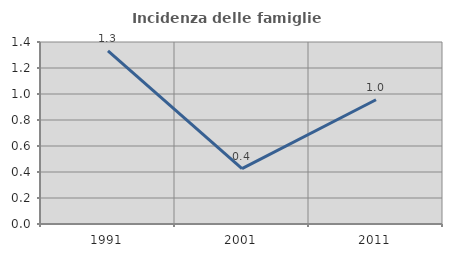
| Category | Incidenza delle famiglie numerose |
|---|---|
| 1991.0 | 1.332 |
| 2001.0 | 0.426 |
| 2011.0 | 0.956 |